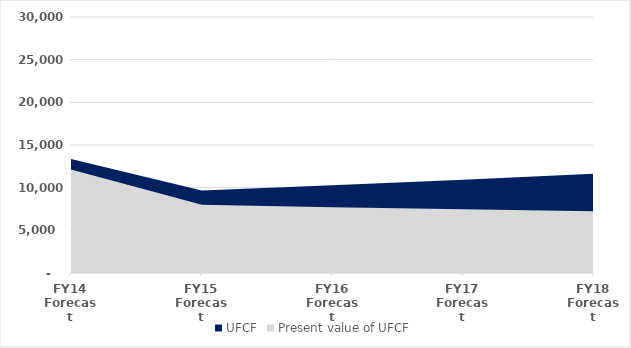
| Category | UFCF | Present value of UFCF |
|---|---|---|
| FY14
Forecast | 13354.818 | 12140.743 |
| FY15
Forecast | 9666.081 | 7988.497 |
| FY16
Forecast | 10273.928 | 7718.954 |
| FY17
Forecast | 10930.402 | 7465.612 |
| FY18
Forecast | 11639.394 | 7227.148 |